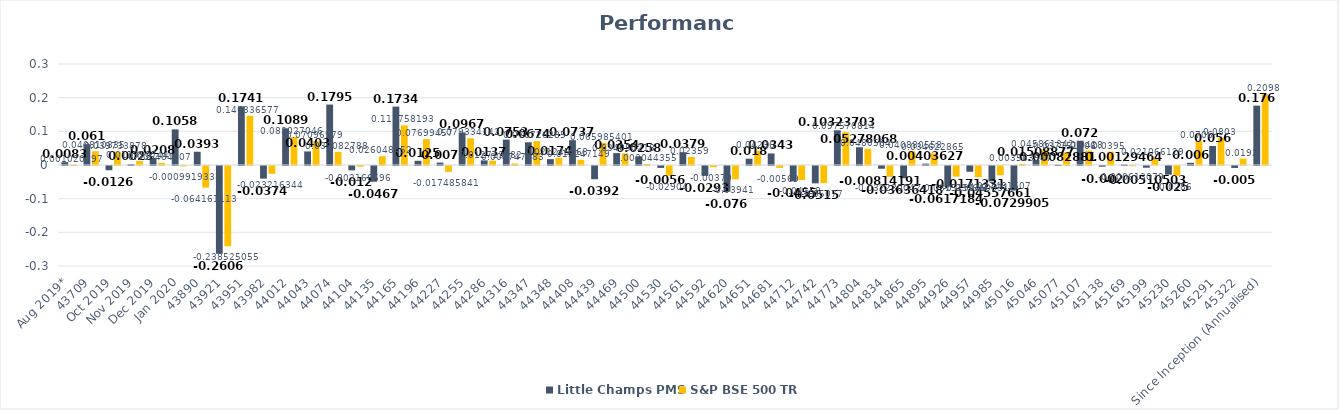
| Category | Little Champs PMS | S&P BSE 500 TR |
|---|---|---|
| Aug 2019* | 0.008 | 0.001 |
| 43709 | 0.062 | 0.041 |
| Oct 2019 | -0.013 | 0.04 |
| Nov 2019 | 0.002 | 0.012 |
| Dec 2019 | 0.021 | 0.006 |
| Jan 2020 | 0.106 | -0.001 |
| 43890 | 0.039 | -0.064 |
| 43921 | -0.261 | -0.239 |
| 43951 | 0.174 | 0.146 |
| 43982 | -0.037 | -0.023 |
| 44012 | 0.109 | 0.083 |
| 44043 | 0.04 | 0.071 |
| 44074 | 0.18 | 0.039 |
| 44104 | -0.013 | -0.002 |
| 44135 | -0.047 | 0.026 |
| 44165 | 0.173 | 0.118 |
| 44196 | 0.013 | 0.077 |
| 44227 | 0.007 | -0.017 |
| 44255 | 0.097 | 0.079 |
| 44286 | 0.014 | 0.013 |
| 44316 | 0.075 | 0.005 |
| 44347 | 0.067 | 0.071 |
| 44348 | 0.017 | 0.021 |
| 44408 | 0.074 | 0.015 |
| 44439 | -0.039 | 0.066 |
| 44469 | 0.035 | 0.034 |
| 44500 | 0.026 | 0.003 |
| 44530 | -0.006 | -0.029 |
| 44561 | 0.038 | 0.024 |
| 44592 | -0.029 | -0.004 |
| 44620 | -0.076 | -0.039 |
| 44651 | 0.019 | 0.042 |
| 44681 | 0.034 | -0.006 |
| 44712 | -0.046 | -0.042 |
| 44742 | -0.052 | -0.051 |
| 44773 | 0.103 | 0.098 |
| 44804 | 0.053 | 0.048 |
| 44834 | -0.008 | -0.032 |
| 44865 | -0.036 | 0.041 |
| 44895 | 0.004 | 0.035 |
| 44926 | -0.062 | -0.032 |
| 44957 | -0.017 | -0.033 |
| 44985 | -0.046 | -0.027 |
| 45016 | -0.073 | 0.004 |
| 45046 | 0.015 | 0.046 |
| 45077 | 0.001 | 0.038 |
| 45107 | 0.072 | 0.043 |
| 45138 | -0.002 | 0.04 |
| 45169 | 0.001 | -0.001 |
| 45199 | -0.005 | 0.021 |
| 45230 | -0.026 | -0.029 |
| 45260 | 0.007 | 0.071 |
| 45291 | 0.056 | 0.08 |
| 45322 | -0.006 | 0.019 |
| Since Inception (Annualised) | 0.176 | 0.21 |